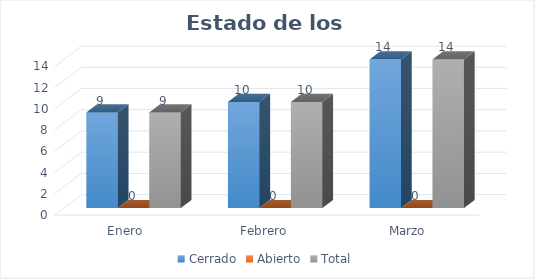
| Category | Cerrado | Abierto | Total |
|---|---|---|---|
| Enero | 9 | 0 | 9 |
| Febrero  | 10 | 0 | 10 |
| Marzo | 14 | 0 | 14 |